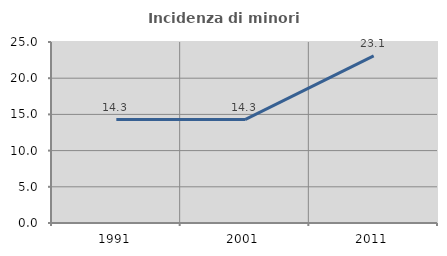
| Category | Incidenza di minori stranieri |
|---|---|
| 1991.0 | 14.286 |
| 2001.0 | 14.286 |
| 2011.0 | 23.077 |